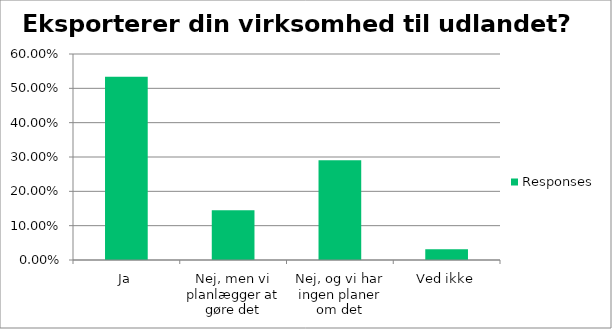
| Category | Responses |
|---|---|
| Ja | 0.534 |
| Nej, men vi planlægger at gøre det | 0.145 |
| Nej, og vi har ingen planer om det | 0.29 |
| Ved ikke | 0.031 |